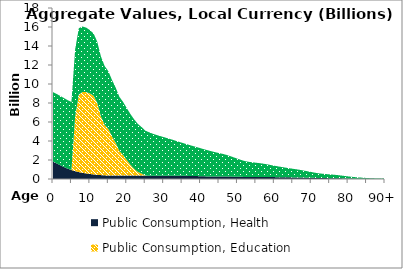
| Category | Public Consumption, Health | Public Consumption, Education | Public Consumption, Other than health and education |
|---|---|---|---|
| 0 | 1834.68 | 0 | 7312.346 |
|  | 1640.082 | 0 | 7312.594 |
| 2 | 1441.919 | 0 | 7294.868 |
| 3 | 1253.249 | 0 | 7260.562 |
| 4 | 1083.198 | 0 | 7211.066 |
| 5 | 941.736 | 17.555 | 7147.783 |
| 6 | 822.089 | 5740.703 | 7072.1 |
| 7 | 725.402 | 8163.732 | 6985.417 |
| 8 | 647.917 | 8516.808 | 6889.124 |
| 9 | 584.522 | 8563.389 | 6784.621 |
| 10 | 526.946 | 8478.991 | 6672.246 |
| 11 | 479.863 | 8282.978 | 6552.356 |
| 12 | 441.256 | 7574.779 | 6431.578 |
| 13 | 408.738 | 6170.688 | 6313.408 |
| 14 | 385.619 | 5312.429 | 6196.094 |
| 15 | 370.037 | 4903.487 | 6073.603 |
| 16 | 359.704 | 4119.166 | 5946.205 |
| 17 | 356.289 | 3444.129 | 5820.953 |
| 18 | 358.255 | 2591.502 | 5700.477 |
| 19 | 358.87 | 2176.894 | 5581.707 |
| 20 | 361.407 | 1639.937 | 5461.104 |
| 21 | 361.853 | 1124.194 | 5341.912 |
| 22 | 361.617 | 706.637 | 5209.942 |
| 23 | 358.659 | 381.018 | 5058.587 |
| 24 | 356.214 | 220.744 | 4895.784 |
| 25 | 353.781 | 2.124 | 4735.19 |
| 26 | 352.067 | 2.331 | 4573.013 |
| 27 | 349.035 | 0 | 4423.488 |
| 28 | 347.87 | 0 | 4294.755 |
| 29 | 348.884 | 0 | 4179.914 |
| 30 | 346.956 | 0 | 4064.218 |
| 31 | 346.351 | 0 | 3950.955 |
| 32 | 344.917 | 0 | 3836.409 |
| 33 | 342.639 | 0 | 3717.351 |
| 34 | 336.663 | 0 | 3596.414 |
| 35 | 335.771 | 0 | 3479.041 |
| 36 | 331.544 | 0 | 3363.69 |
| 37 | 326.335 | 0 | 3252.799 |
| 38 | 316.139 | 0 | 3147.972 |
| 39 | 306.978 | 0 | 3047.507 |
| 40 | 292.56 | 0 | 2947.245 |
| 41 | 279.637 | 0 | 2847.005 |
| 42 | 269.439 | 0 | 2749.347 |
| 43 | 263.927 | 0 | 2654.8 |
| 44 | 260.502 | 0 | 2561.609 |
| 45 | 260.433 | 0 | 2470.274 |
| 46 | 260.596 | 0 | 2384.006 |
| 47 | 257.885 | 0 | 2284.446 |
| 48 | 253.59 | 0 | 2163.555 |
| 49 | 245.55 | 0 | 2031.309 |
| 50 | 236.817 | 0 | 1903.543 |
| 51 | 227.371 | 0 | 1774.555 |
| 52 | 220.215 | 0 | 1667.891 |
| 53 | 216.965 | 0 | 1596.061 |
| 54 | 217.69 | 0 | 1547.183 |
| 55 | 217.714 | 0 | 1497.152 |
| 56 | 217.687 | 0 | 1451.079 |
| 57 | 216.23 | 0 | 1399.891 |
| 58 | 211.733 | 0 | 1336.754 |
| 59 | 205.037 | 0 | 1266.629 |
| 60 | 198.37 | 0 | 1201.091 |
| 61 | 191.998 | 0 | 1137.485 |
| 62 | 185.765 | 0 | 1076.338 |
| 63 | 179.96 | 0 | 1018.944 |
| 64 | 174.199 | 0 | 963.999 |
| 65 | 168.275 | 0 | 909.814 |
| 66 | 162.398 | 0 | 857.932 |
| 67 | 155.456 | 0 | 802.255 |
| 68 | 146.726 | 0 | 739.984 |
| 69 | 136.917 | 0 | 674.621 |
| 70 | 126.495 | 0 | 611.586 |
| 71 | 115.464 | 0 | 548.66 |
| 72 | 105.813 | 0 | 495.198 |
| 73 | 98.813 | 0 | 456.015 |
| 74 | 93.655 | 0 | 426.343 |
| 75 | 88.813 | 0 | 397.094 |
| 76 | 83.806 | 0 | 370.747 |
| 77 | 77.473 | 0 | 340.915 |
| 78 | 69.022 | 0 | 303.725 |
| 79 | 59.692 | 0 | 262.668 |
| 80 | 51.135 | 0 | 225.015 |
| 81 | 43.011 | 0 | 189.266 |
| 82 | 35.782 | 0 | 157.455 |
| 83 | 29.85 | 0 | 131.352 |
| 84 | 24.923 | 0 | 109.672 |
| 85 | 20.277 | 0 | 89.229 |
| 86 | 16.005 | 0 | 70.43 |
| 87 | 12.376 | 0 | 54.458 |
| 88 | 9.431 | 0 | 41.501 |
| 89 | 7.073 | 0 | 31.123 |
| 90+ | 14.589 | 0 | 64.196 |